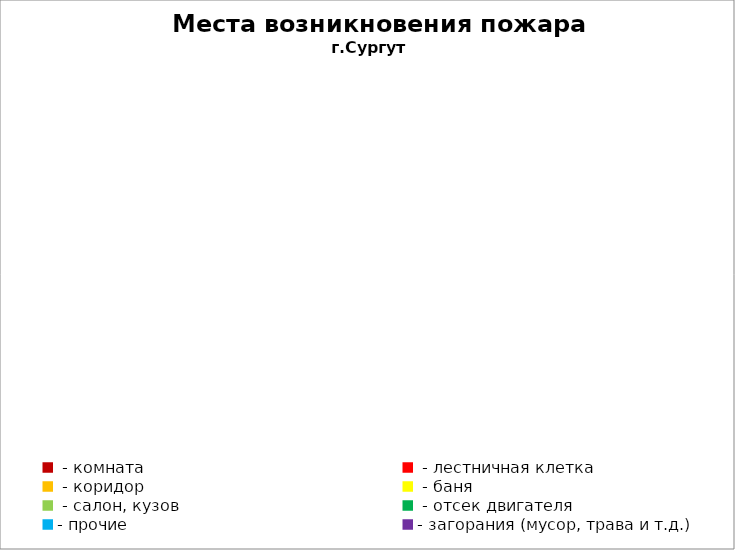
| Category | Места возникновения пожара |
|---|---|
|  - комната | 50 |
|  - лестничная клетка | 10 |
|  - коридор | 7 |
|  - баня | 47 |
|  - салон, кузов | 24 |
|  - отсек двигателя | 34 |
| - прочие | 117 |
| - загорания (мусор, трава и т.д.)  | 112 |